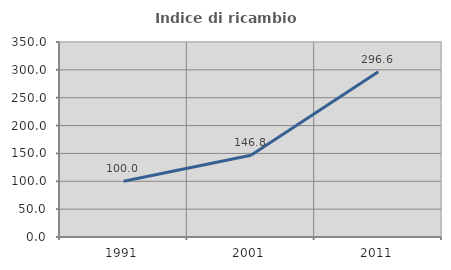
| Category | Indice di ricambio occupazionale  |
|---|---|
| 1991.0 | 100 |
| 2001.0 | 146.753 |
| 2011.0 | 296.591 |